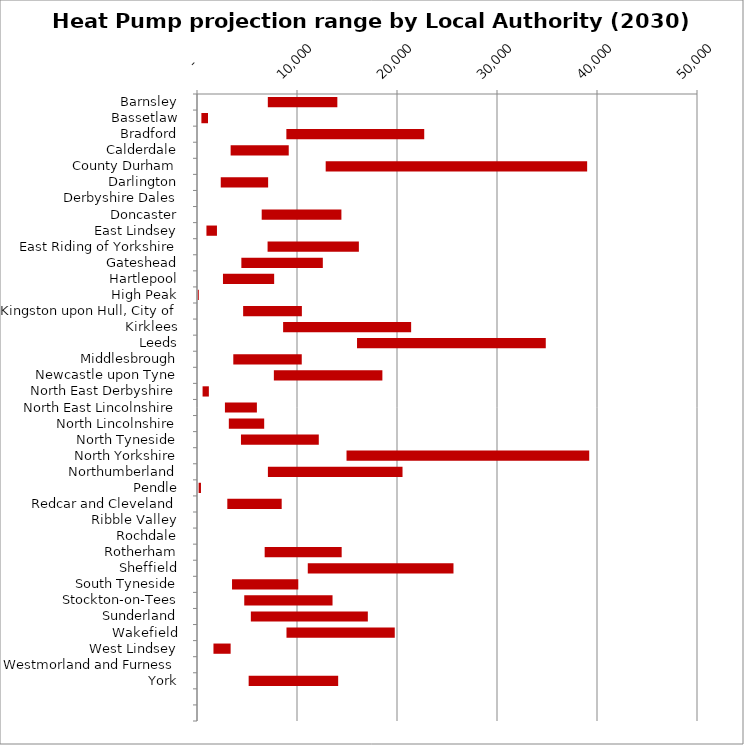
| Category | MIN | MAX |
|---|---|---|
| Barnsley | 7082 | 6952 |
| Bassetlaw | 439 | 661 |
| Bradford | 8937 | 13786 |
| Calderdale | 3364 | 5810 |
| County Durham | 12869 | 26146 |
| Darlington | 2376 | 4737 |
| Derbyshire Dales | 7 | 6 |
| Doncaster | 6470 | 7970 |
| East Lindsey | 944 | 1052 |
| East Riding of Yorkshire | 7058 | 9129 |
| Gateshead | 4436 | 8146 |
| Hartlepool | 2597 | 5119 |
| High Peak | 82 | 95 |
| Kingston upon Hull, City of | 4614 | 5873 |
| Kirklees | 8612 | 12802 |
| Leeds | 16003 | 18874 |
| Middlesbrough | 3630 | 6845 |
| Newcastle upon Tyne | 7687 | 10851 |
| North East Derbyshire | 558 | 628 |
| North East Lincolnshire | 2793 | 3196 |
| North Lincolnshire | 3183 | 3536 |
| North Tyneside | 4397 | 7782 |
| North Yorkshire | 14953 | 24269 |
| Northumberland | 7090 | 13462 |
| Pendle | 162 | 234 |
| Redcar and Cleveland | 3031 | 5438 |
| Ribble Valley | 2 | 2 |
| Rochdale | 0 | 1 |
| Rotherham | 6767 | 7700 |
| Sheffield | 11078 | 14570 |
| South Tyneside | 3503 | 6625 |
| Stockton-on-Tees | 4725 | 8828 |
| Sunderland | 5384 | 11699 |
| Wakefield | 8949 | 10827 |
| West Lindsey | 1646 | 1717 |
| Westmorland and Furness | 0 | 1 |
| York | 5166 | 8951 |